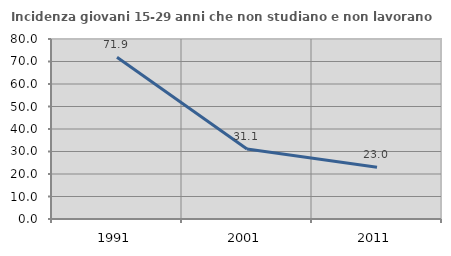
| Category | Incidenza giovani 15-29 anni che non studiano e non lavorano  |
|---|---|
| 1991.0 | 71.903 |
| 2001.0 | 31.119 |
| 2011.0 | 23.028 |